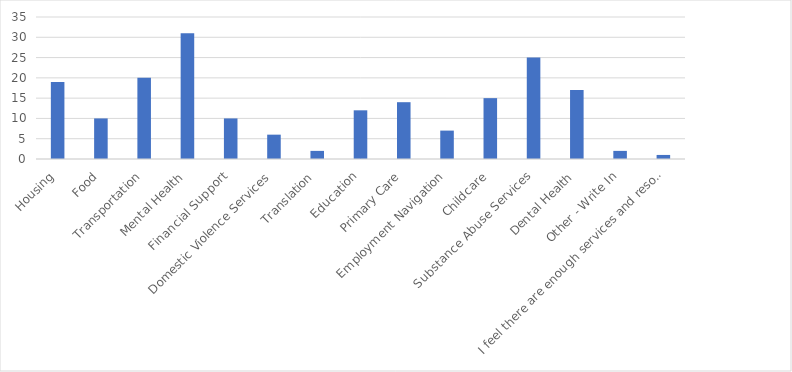
| Category | Number of Responses |
|---|---|
| Housing | 19 |
| Food | 10 |
| Transportation | 20 |
| Mental Health | 31 |
| Financial Support | 10 |
| Domestic Violence Services | 6 |
| Translation | 2 |
| Education | 12 |
| Primary Care | 14 |
| Employment Navigation | 7 |
| Childcare | 15 |
| Substance Abuse Services | 25 |
| Dental Health | 17 |
| Other - Write In | 2 |
| I feel there are enough services and resources to refer my patients/clients to. | 1 |